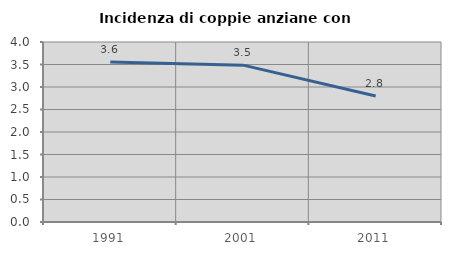
| Category | Incidenza di coppie anziane con figli |
|---|---|
| 1991.0 | 3.554 |
| 2001.0 | 3.485 |
| 2011.0 | 2.798 |